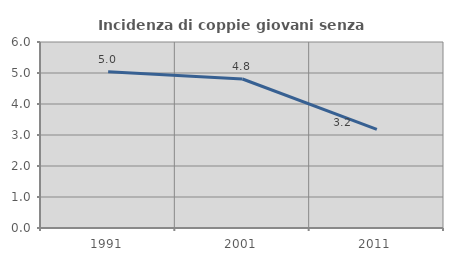
| Category | Incidenza di coppie giovani senza figli |
|---|---|
| 1991.0 | 5.042 |
| 2001.0 | 4.806 |
| 2011.0 | 3.18 |